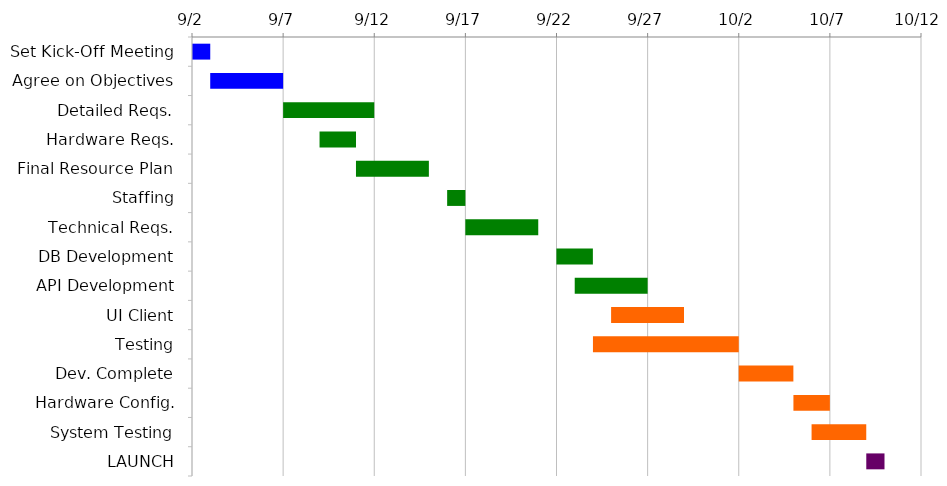
| Category | START | DAYS |
|---|---|---|
| Set Kick-Off Meeting | 2022-09-02 | 1 |
| Agree on Objectives | 2022-09-03 | 4 |
| Detailed Reqs. | 2022-09-07 | 5 |
| Hardware Reqs. | 2022-09-09 | 2 |
| Final Resource Plan | 2022-09-11 | 4 |
| Staffing | 2022-09-16 | 1 |
| Technical Reqs. | 2022-09-17 | 4 |
| DB Development | 2022-09-22 | 2 |
| API Development | 2022-09-23 | 4 |
| UI Client | 2022-09-25 | 4 |
| Testing | 2022-09-24 | 8 |
| Dev. Complete | 2022-10-02 | 3 |
| Hardware Config. | 2022-10-05 | 2 |
| System Testing | 2022-10-06 | 3 |
| LAUNCH | 2022-10-09 | 1 |